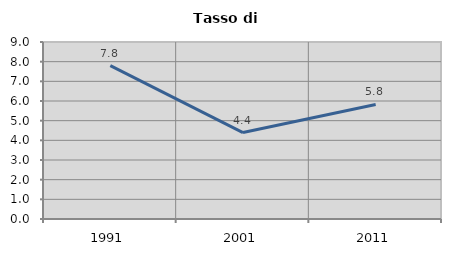
| Category | Tasso di disoccupazione   |
|---|---|
| 1991.0 | 7.797 |
| 2001.0 | 4.394 |
| 2011.0 | 5.823 |